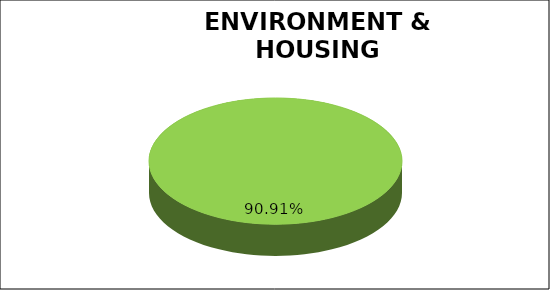
| Category | Green | Amber | Red |
|---|---|---|---|
| Q1 | 0.909 | 0.091 | 0 |